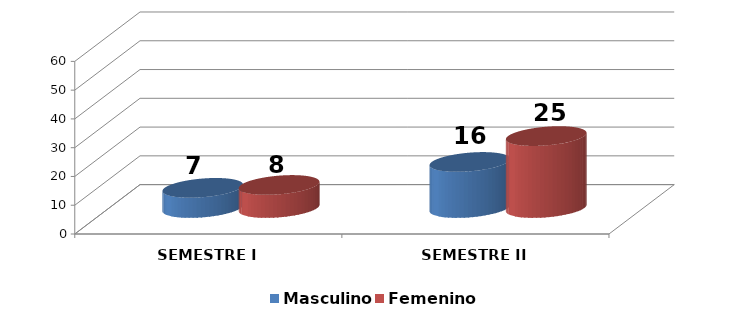
| Category | Masculino | Femenino |
|---|---|---|
| SEMESTRE I | 7 | 8 |
| SEMESTRE II | 16 | 25 |